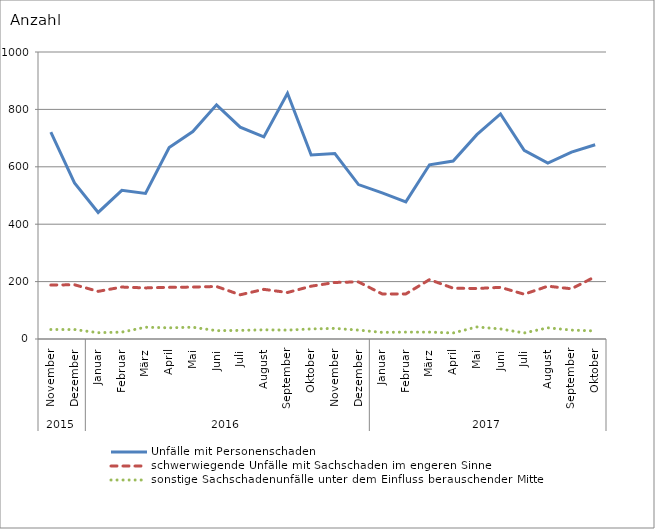
| Category | Unfälle mit Personenschaden | schwerwiegende Unfälle mit Sachschaden im engeren Sinne | sonstige Sachschadenunfälle unter dem Einfluss berauschender Mittel |
|---|---|---|---|
| 0 | 721 | 188 | 33 |
| 1 | 544 | 189 | 33 |
| 2 | 441 | 166 | 22 |
| 3 | 518 | 181 | 24 |
| 4 | 507 | 178 | 41 |
| 5 | 667 | 180 | 39 |
| 6 | 723 | 181 | 41 |
| 7 | 816 | 183 | 29 |
| 8 | 738 | 154 | 30 |
| 9 | 704 | 173 | 32 |
| 10 | 856 | 162 | 31 |
| 11 | 641 | 184 | 35 |
| 12 | 646 | 197 | 37 |
| 13 | 538 | 199 | 31 |
| 14 | 509 | 157 | 23 |
| 15 | 478 | 157 | 24 |
| 16 | 607 | 207 | 24 |
| 17 | 620 | 177 | 21 |
| 18 | 712 | 176 | 42 |
| 19 | 784 | 180 | 35 |
| 20 | 657 | 156 | 21 |
| 21 | 613 | 184 | 39 |
| 22 | 651 | 175 | 31 |
| 23 | 677 | 217 | 28 |